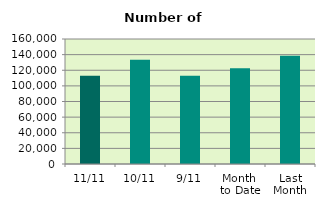
| Category | Series 0 |
|---|---|
| 11/11 | 113076 |
| 10/11 | 133406 |
| 9/11 | 112900 |
| Month 
to Date | 122447.333 |
| Last
Month | 138693.238 |